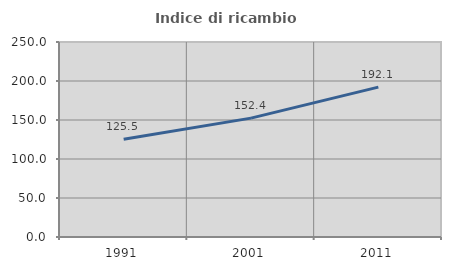
| Category | Indice di ricambio occupazionale  |
|---|---|
| 1991.0 | 125.455 |
| 2001.0 | 152.381 |
| 2011.0 | 192.105 |